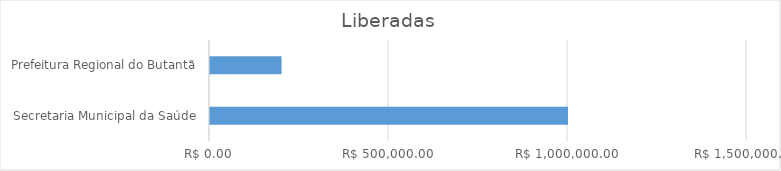
| Category | Series 0 |
|---|---|
| Secretaria Municipal da Saúde | 1000000 |
| Prefeitura Regional do Butantã | 200000 |